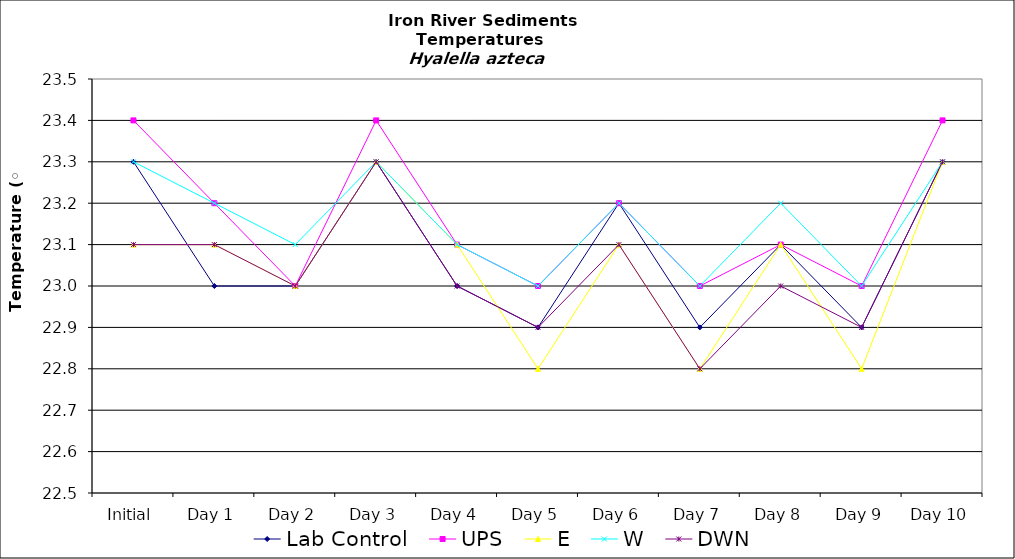
| Category | Lab Control | UPS | E | W | DWN |
|---|---|---|---|---|---|
| Initial | 23.3 | 23.4 | 23.1 | 23.3 | 23.1 |
| Day 1 | 23 | 23.2 | 23.1 | 23.2 | 23.1 |
| Day 2 | 23 | 23 | 23 | 23.1 | 23 |
| Day 3 | 23.3 | 23.4 | 23.3 | 23.3 | 23.3 |
| Day 4 | 23 | 23.1 | 23.1 | 23.1 | 23 |
| Day 5 | 22.9 | 23 | 22.8 | 23 | 22.9 |
| Day 6 | 23.2 | 23.2 | 23.1 | 23.2 | 23.1 |
| Day 7 | 22.9 | 23 | 22.8 | 23 | 22.8 |
| Day 8 | 23.1 | 23.1 | 23.1 | 23.2 | 23 |
| Day 9 | 22.9 | 23 | 22.8 | 23 | 22.9 |
| Day 10 | 23.3 | 23.4 | 23.3 | 23.3 | 23.3 |